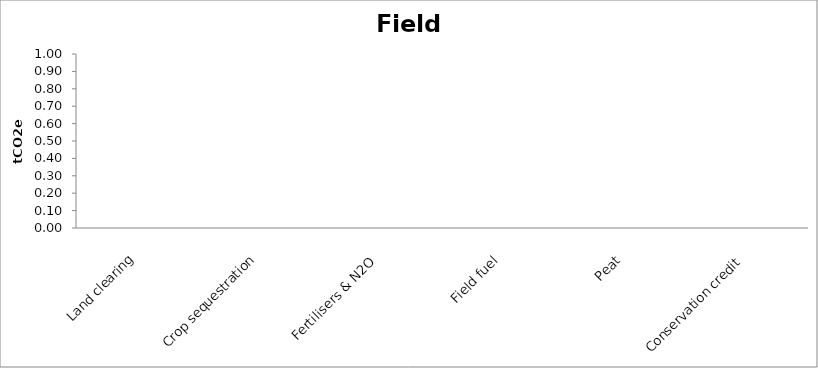
| Category | Series 0 |
|---|---|
| Land clearing | 0 |
| Crop sequestration | 0 |
| Fertilisers & N2O | 0 |
| Field fuel | 0 |
| Peat  | 0 |
| Conservation credit | 0 |